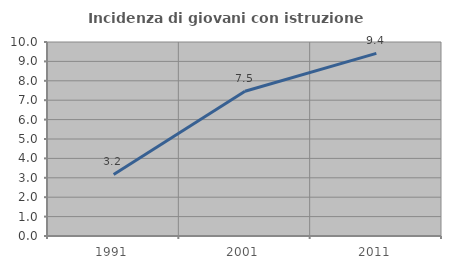
| Category | Incidenza di giovani con istruzione universitaria |
|---|---|
| 1991.0 | 3.175 |
| 2001.0 | 7.463 |
| 2011.0 | 9.412 |